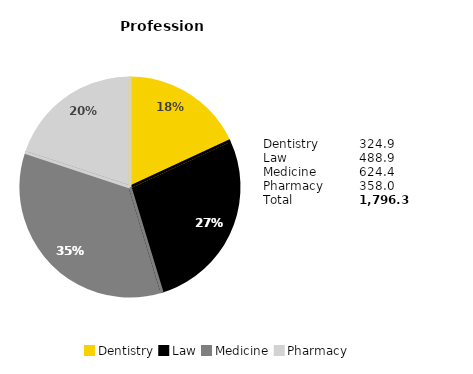
| Category | Series 0 |
|---|---|
| Dentistry | 0.181 |
| Law | 0.272 |
| Medicine | 0.348 |
| Pharmacy | 0.199 |